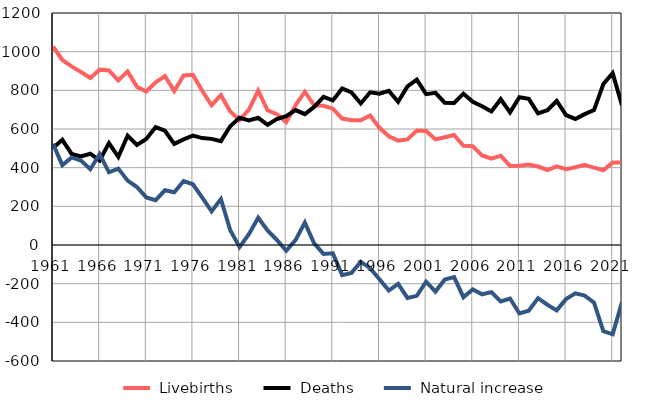
| Category |  Livebirths |  Deaths |  Natural increase |
|---|---|---|---|
| 1961.0 | 1026 | 502 | 524 |
| 1962.0 | 957 | 544 | 413 |
| 1963.0 | 924 | 471 | 453 |
| 1964.0 | 895 | 458 | 437 |
| 1965.0 | 864 | 472 | 392 |
| 1966.0 | 907 | 437 | 470 |
| 1967.0 | 903 | 527 | 376 |
| 1968.0 | 851 | 456 | 395 |
| 1969.0 | 898 | 565 | 333 |
| 1970.0 | 818 | 518 | 300 |
| 1971.0 | 794 | 548 | 246 |
| 1972.0 | 842 | 610 | 232 |
| 1973.0 | 874 | 591 | 283 |
| 1974.0 | 796 | 523 | 273 |
| 1975.0 | 877 | 546 | 331 |
| 1976.0 | 880 | 566 | 314 |
| 1977.0 | 798 | 553 | 245 |
| 1978.0 | 723 | 549 | 174 |
| 1979.0 | 775 | 537 | 238 |
| 1980.0 | 691 | 614 | 77 |
| 1981.0 | 647 | 658 | -11 |
| 1982.0 | 700 | 644 | 56 |
| 1983.0 | 799 | 658 | 141 |
| 1984.0 | 697 | 622 | 75 |
| 1985.0 | 677 | 651 | 26 |
| 1986.0 | 636 | 666 | -30 |
| 1987.0 | 723 | 698 | 25 |
| 1988.0 | 793 | 677 | 116 |
| 1989.0 | 722 | 714 | 8 |
| 1990.0 | 720 | 766 | -46 |
| 1991.0 | 705 | 748 | -43 |
| 1992.0 | 654 | 810 | -156 |
| 1993.0 | 645 | 789 | -144 |
| 1994.0 | 645 | 732 | -87 |
| 1995.0 | 670 | 790 | -120 |
| 1996.0 | 606 | 783 | -177 |
| 1997.0 | 562 | 798 | -236 |
| 1998.0 | 540 | 741 | -201 |
| 1999.0 | 546 | 820 | -274 |
| 2000.0 | 592 | 855 | -263 |
| 2001.0 | 590 | 780 | -190 |
| 2002.0 | 546 | 787 | -241 |
| 2003.0 | 557 | 736 | -179 |
| 2004.0 | 569 | 735 | -166 |
| 2005.0 | 513 | 783 | -270 |
| 2006.0 | 511 | 741 | -230 |
| 2007.0 | 463 | 718 | -255 |
| 2008.0 | 447 | 691 | -244 |
| 2009.0 | 462 | 754 | -292 |
| 2010.0 | 409 | 686 | -277 |
| 2011.0 | 410 | 764 | -354 |
| 2012.0 | 416 | 756 | -340 |
| 2013.0 | 406 | 681 | -275 |
| 2014.0 | 388 | 697 | -309 |
| 2015.0 | 407 | 745 | -338 |
| 2016.0 | 392 | 672 | -280 |
| 2017.0 | 402 | 652 | -250 |
| 2018.0 | 415 | 677 | -262 |
| 2019.0 | 400 | 698 | -298 |
| 2020.0 | 387 | 833 | -446 |
| 2021.0 | 427 | 889 | -462 |
| 2022.0 | 427 | 722 | -295 |